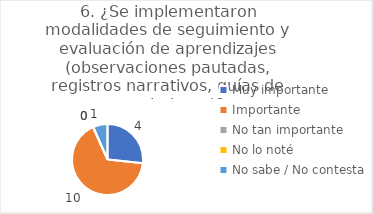
| Category | 6. ¿Se implementaron modalidades de seguimiento y evaluación de aprendizajes (observaciones pautadas, registros narrativos, guías de seguimiento)? |
|---|---|
| Muy importante  | 0.267 |
| Importante  | 0.667 |
| No tan importante  | 0 |
| No lo noté  | 0 |
| No sabe / No contesta | 0.067 |